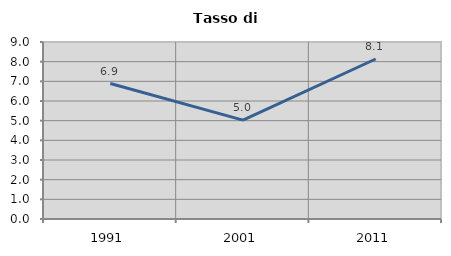
| Category | Tasso di disoccupazione   |
|---|---|
| 1991.0 | 6.888 |
| 2001.0 | 5.028 |
| 2011.0 | 8.135 |